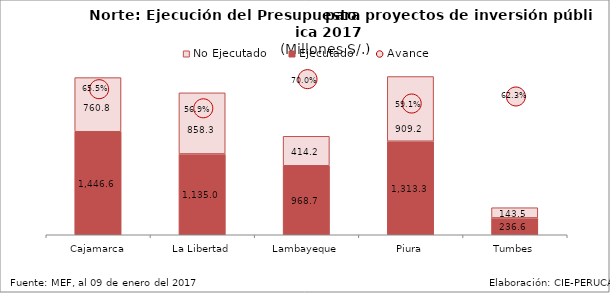
| Category | Ejecutado | No Ejecutado |
|---|---|---|
| Cajamarca | 1446.638 | 760.777 |
| La Libertad | 1134.999 | 858.289 |
| Lambayeque | 968.75 | 414.209 |
| Piura | 1313.286 | 909.247 |
| Tumbes | 236.577 | 143.453 |